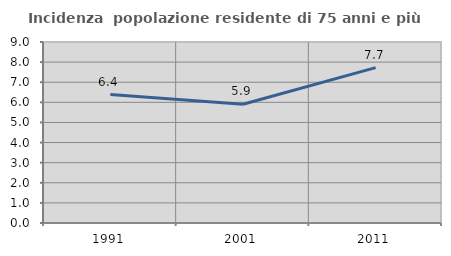
| Category | Incidenza  popolazione residente di 75 anni e più |
|---|---|
| 1991.0 | 6.384 |
| 2001.0 | 5.903 |
| 2011.0 | 7.727 |